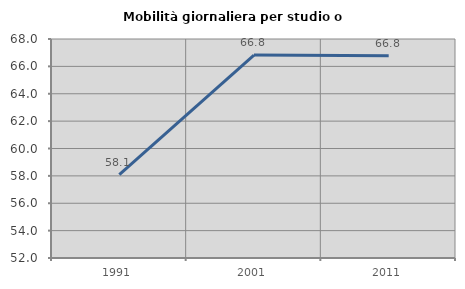
| Category | Mobilità giornaliera per studio o lavoro |
|---|---|
| 1991.0 | 58.099 |
| 2001.0 | 66.825 |
| 2011.0 | 66.777 |